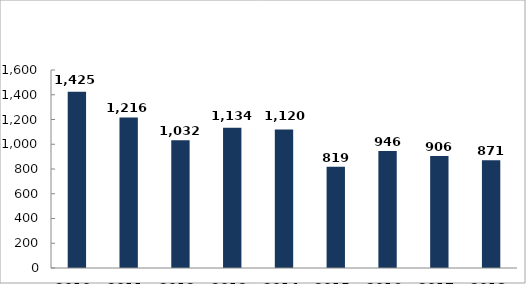
| Category | Büntető feljelentések száma |
|---|---|
| 2010. év | 1425 |
| 2011. év | 1216 |
| 2012. év | 1032 |
| 2013. év | 1134 |
| 2014. év | 1120 |
| 2015. év | 819 |
| 2016. év | 946 |
| 2017. év | 906 |
| 2018. év | 871 |